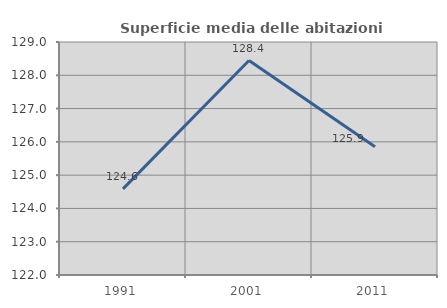
| Category | Superficie media delle abitazioni occupate |
|---|---|
| 1991.0 | 124.586 |
| 2001.0 | 128.444 |
| 2011.0 | 125.85 |